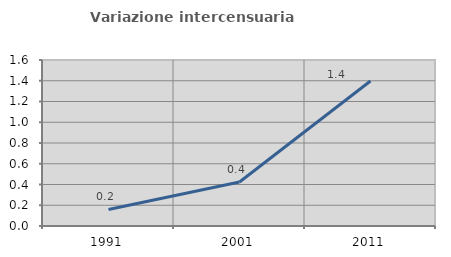
| Category | Variazione intercensuaria annua |
|---|---|
| 1991.0 | 0.159 |
| 2001.0 | 0.425 |
| 2011.0 | 1.397 |